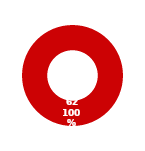
| Category | Series 10 |
|---|---|
| Count Complete | 0 |
| Count Not Complete | 62 |